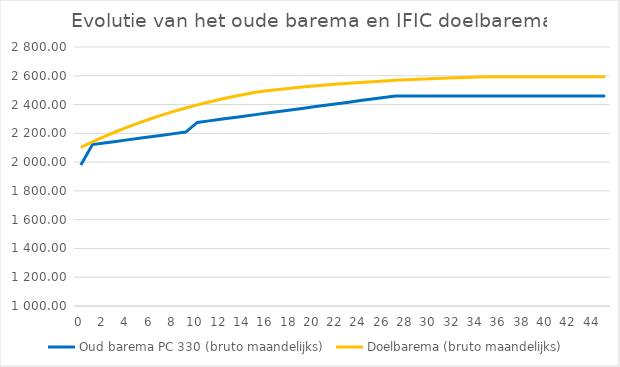
| Category | Oud barema PC 330 (bruto maandelijks) | Doelbarema | Doelbarema (bruto maandelijks) |
|---|---|---|---|
| 0.0 | 1980.59 |  | 2101.97 |
| 1.0 | 2121.98 |  | 2140.54 |
| 2.0 | 2132.84 |  | 2176.87 |
| 3.0 | 2143.7 |  | 2211.04 |
| 4.0 | 2154.55 |  | 2243.14 |
| 5.0 | 2165.41 |  | 2273.28 |
| 6.0 | 2176.26 |  | 2301.52 |
| 7.0 | 2187.11 |  | 2327.96 |
| 8.0 | 2197.97 |  | 2352.7 |
| 9.0 | 2208.83 |  | 2375.84 |
| 10.0 | 2275.66 |  | 2397.44 |
| 11.0 | 2286.51 |  | 2417.61 |
| 12.0 | 2297.37 |  | 2436.42 |
| 13.0 | 2308.23 |  | 2453.95 |
| 14.0 | 2319.08 |  | 2470.29 |
| 15.0 | 2329.94 |  | 2485.51 |
| 16.0 | 2340.79 |  | 2495.56 |
| 17.0 | 2351.65 |  | 2504.9 |
| 18.0 | 2362.5 |  | 2513.57 |
| 19.0 | 2373.36 |  | 2521.62 |
| 20.0 | 2384.22 |  | 2529.1 |
| 21.0 | 2395.07 |  | 2536.02 |
| 22.0 | 2405.92 |  | 2542.44 |
| 23.0 | 2416.78 |  | 2548.41 |
| 24.0 | 2427.64 |  | 2553.94 |
| 25.0 | 2438.49 |  | 2559.06 |
| 26.0 | 2449.35 |  | 2563.81 |
| 27.0 | 2460.2 |  | 2568.2 |
| 28.0 | 2460.2 |  | 2572.29 |
| 29.0 | 2460.2 |  | 2576.06 |
| 30.0 | 2460.2 |  | 2579.56 |
| 31.0 | 2460.2 |  | 2582.8 |
| 32.0 | 2460.2 |  | 2585.8 |
| 33.0 | 2460.2 |  | 2588.58 |
| 34.0 | 2460.2 |  | 2591.16 |
| 35.0 | 2460.2 |  | 2593.54 |
| 36.0 | 2460.2 |  | 2593.54 |
| 37.0 | 2460.2 |  | 2593.54 |
| 38.0 | 2460.2 |  | 2593.54 |
| 39.0 | 2460.2 |  | 2593.54 |
| 40.0 | 2460.2 |  | 2593.54 |
| 41.0 | 2460.2 |  | 2593.54 |
| 42.0 | 2460.2 |  | 2593.54 |
| 43.0 | 2460.2 |  | 2593.54 |
| 44.0 | 2460.2 |  | 2593.54 |
| 45.0 | 2460.2 |  | 2593.54 |